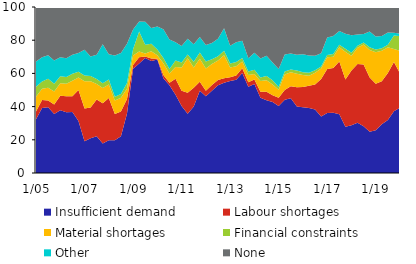
| Category | Insufficient demand | Labour shortages | Material shortages | Financial constraints | Other | None |
|---|---|---|---|---|---|---|
|  1/05 | 32.4 | 4.7 | 8.8 | 6 | 15.3 | 32.8 |
| 4 | 39.2 | 4.8 | 6.7 | 4.4 | 14.7 | 30.2 |
| 7 | 39.6 | 4.1 | 7.6 | 5.5 | 14.1 | 29.1 |
| 10 | 35.5 | 5.7 | 7.9 | 4.6 | 14.1 | 32.2 |
|  1/06 | 37.8 | 8.7 | 7.5 | 4.3 | 11.5 | 30.2 |
| 4 | 36.6 | 9.6 | 7.6 | 4 | 11.3 | 30.9 |
| 7 | 36.8 | 9.5 | 9.3 | 4.2 | 11.4 | 28.8 |
| 10 | 31.4 | 18.6 | 7.5 | 3.5 | 11.3 | 27.7 |
|  1/07 | 19.1 | 19.7 | 16.5 | 3.4 | 15.6 | 25.7 |
| 4 | 21 | 18.5 | 15.7 | 3.2 | 11.8 | 29.8 |
| 7 | 22.2 | 22.1 | 9.3 | 3.1 | 14.5 | 28.8 |
| 10 | 17.7 | 24.3 | 9.2 | 2.9 | 23.5 | 22.4 |
|  1/08 | 19.8 | 25.4 | 8.1 | 3 | 15.2 | 28.5 |
| 4 | 19.7 | 15.8 | 8.1 | 2.3 | 24.9 | 29.2 |
| 7 | 22.2 | 14.9 | 8.2 | 2.3 | 24.7 | 27.7 |
| 10 | 35.9 | 8.7 | 6.3 | 3.3 | 23.7 | 22.1 |
|  1/09 | 62.8 | 2.3 | 5.7 | 3.8 | 11.8 | 13.6 |
| 4 | 65.9 | 3.8 | 3.5 | 12.1 | 6 | 8.7 |
| 7 | 69.3 | 0.9 | 1.8 | 5.3 | 13.8 | 8.9 |
| 10 | 67.5 | 1.5 | 4.4 | 4.4 | 9.6 | 12.6 |
|  1/10 | 68.4 | 0.5 | 2.1 | 3.4 | 13.8 | 11.8 |
| 4 | 57.1 | 2 | 7 | 3.2 | 17.3 | 13.4 |
| 7 | 52.8 | 1.6 | 5.6 | 2.7 | 17.7 | 19.6 |
| 10 | 47.2 | 9.6 | 7.1 | 3.9 | 11 | 21.2 |
|  1/11 | 40.3 | 9.3 | 14 | 2.9 | 10 | 23.5 |
| 4 | 35.7 | 12.7 | 20.8 | 2.2 | 9.5 | 19.1 |
| 7 | 40 | 11.3 | 12.3 | 3.4 | 10.5 | 22.5 |
| 10 | 49.5 | 5.5 | 13.8 | 3.8 | 9.3 | 18.1 |
|  1/12 | 46.2 | 3.3 | 13.4 | 4.3 | 9.9 | 22.9 |
| 4 | 49.6 | 3.4 | 12.6 | 2.9 | 9.8 | 21.7 |
| 7 | 52.8 | 3.2 | 11.7 | 2.6 | 10.5 | 19.2 |
| 10 | 54.4 | 2.7 | 13.8 | 2.8 | 13.5 | 12.8 |
|  1/13 | 55.4 | 2.3 | 5.8 | 2.5 | 10.6 | 23.4 |
| 4 | 56.2 | 2.5 | 5.6 | 2.6 | 11.9 | 21.2 |
| 7 | 60.3 | 2.8 | 4 | 2.2 | 10.4 | 20.3 |
| 10 | 52 | 2.7 | 4.3 | 2.1 | 8.1 | 30.8 |
|  1/14 | 53.6 | 2.8 | 3.3 | 2.5 | 10.3 | 27.5 |
| 4 | 45.4 | 3.5 | 6.5 | 2.2 | 11.4 | 31 |
| 7 | 43.9 | 5 | 7 | 2.5 | 12.3 | 29.3 |
| 10 | 42.8 | 4 | 6.5 | 2.5 | 10.8 | 33.4 |
|  1/15 | 40.3 | 5 | 4.8 | 1.7 | 10.8 | 37.4 |
| 4 | 44.2 | 5.8 | 9.4 | 1.8 | 10.2 | 28.6 |
| 7 | 45 | 7.3 | 8.4 | 1.7 | 9.6 | 28 |
| 10 | 40 | 11.6 | 8.2 | 2 | 9.4 | 28.8 |
|  1/16 | 39.6 | 12.2 | 7.3 | 1.6 | 10.8 | 28.5 |
| 4 | 39.2 | 13.3 | 6.1 | 1.8 | 10.4 | 29.2 |
| 7 | 38.2 | 15.1 | 7.1 | 1.5 | 8.7 | 29.4 |
| 10 | 34 | 22.6 | 6.4 | 1.1 | 8.1 | 27.8 |
|  1/17 | 36.1 | 26.6 | 7.1 | 1.3 | 10.5 | 18.4 |
| 4 | 36.3 | 27 | 6.7 | 1.7 | 10.9 | 17.4 |
| 7 | 35.4 | 31.8 | 8.5 | 1.5 | 8.3 | 14.5 |
| 10 | 27.8 | 28.5 | 16.8 | 1.8 | 9 | 16.1 |
|  1/18 | 28.7 | 33 | 9 | 1.7 | 10.6 | 17 |
| 4 | 30.3 | 35.4 | 9.8 | 1.1 | 6.8 | 16.3 |
| 7 | 28.1 | 37.3 | 12 | 1.2 | 5.1 | 16.3 |
| 10 | 24.8 | 32.7 | 16.6 | 1.6 | 9.5 | 14.8 |
|  1/19 | 25.8 | 28 | 19 | 1.6 | 7.8 | 17.8 |
| 4 | 29.3 | 26 | 18.3 | 1.6 | 7.3 | 17.5 |
| 7 | 31.9 | 28.4 | 15.5 | 1.4 | 7.4 | 15.4 |
| 10 | 37.2 | 29.6 | 7.9 | 8.2 | 1.6 | 15.5 |
|  1/20 | 39.3 | 20.8 | 13.5 | 8.9 | 1.5 | 16 |